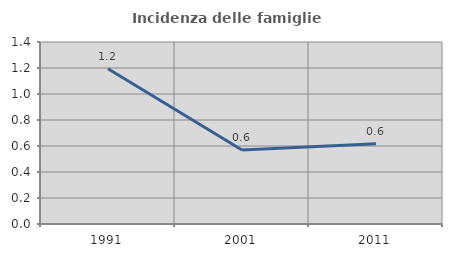
| Category | Incidenza delle famiglie numerose |
|---|---|
| 1991.0 | 1.194 |
| 2001.0 | 0.569 |
| 2011.0 | 0.618 |